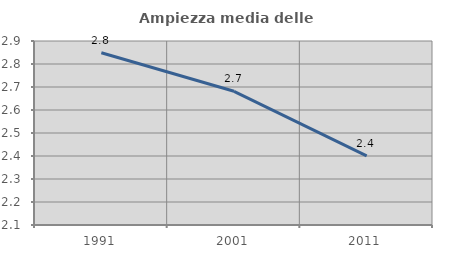
| Category | Ampiezza media delle famiglie |
|---|---|
| 1991.0 | 2.849 |
| 2001.0 | 2.681 |
| 2011.0 | 2.4 |